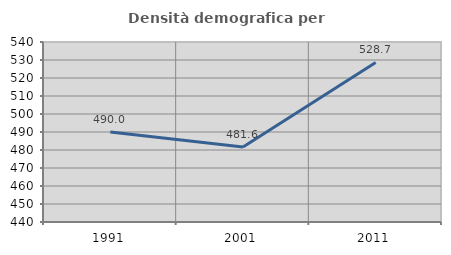
| Category | Densità demografica |
|---|---|
| 1991.0 | 489.978 |
| 2001.0 | 481.645 |
| 2011.0 | 528.655 |